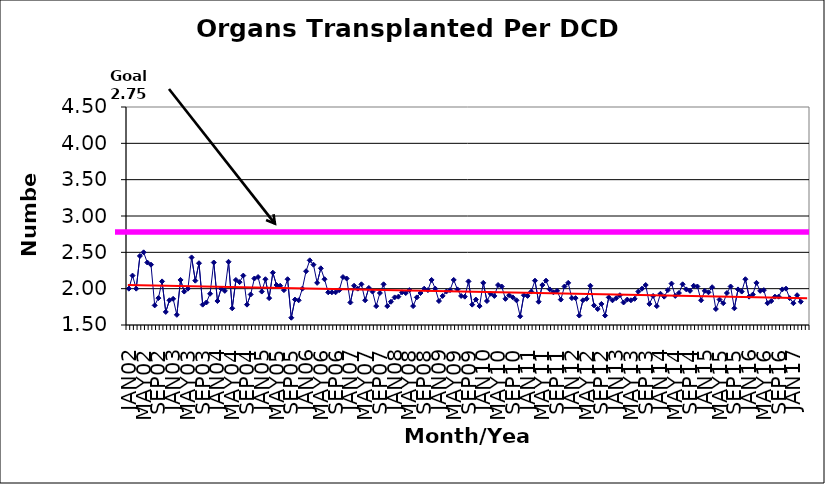
| Category | Series 0 |
|---|---|
| JAN02 | 2 |
| FEB02 | 2.18 |
| MAR02 | 2 |
| APR02 | 2.45 |
| MAY02 | 2.5 |
| JUN02 | 2.36 |
| JUL02 | 2.33 |
| AUG02 | 1.77 |
| SEP02 | 1.87 |
| OCT02 | 2.1 |
| NOV02 | 1.68 |
| DEC02 | 1.84 |
| JAN03 | 1.86 |
| FEB03 | 1.64 |
| MAR03 | 2.12 |
| APR03 | 1.96 |
| MAY03 | 2 |
| JUN03 | 2.43 |
| JUL03 | 2.11 |
| AUG03 | 2.35 |
| SEP03 | 1.78 |
| OCT03 | 1.81 |
| NOV03 | 1.93 |
| DEC03 | 2.36 |
| JAN04 | 1.83 |
| FEB04 | 2 |
| MAR04 | 1.97 |
| APR04 | 2.37 |
| MAY04 | 1.73 |
| JUN04 | 2.12 |
| JUL04 | 2.09 |
| AUG04 | 2.18 |
| SEP04 | 1.78 |
| OCT04 | 1.92 |
| NOV04 | 2.14 |
| DEC04 | 2.16 |
| JAN05 | 1.96 |
| FEB05 | 2.13 |
| MAR05 | 1.87 |
| APR05 | 2.22 |
| MAY05 | 2.05 |
| JUN05 | 2.04 |
| JUL05 | 1.98 |
| AUG05 | 2.13 |
| SEP05 | 1.6 |
| OCT05 | 1.85 |
| NOV05 | 1.84 |
| DEC05 | 2 |
| JAN06 | 2.24 |
| FEB06 | 2.39 |
| MAR06 | 2.33 |
| APR06 | 2.08 |
| MAY06 | 2.28 |
| JUN06 | 2.13 |
| JUL06 | 1.95 |
| AUG06 | 1.95 |
| SEP06 | 1.95 |
| OCT06 | 1.98 |
| NOV06 | 2.16 |
| DEC06 | 2.14 |
| JAN07 | 1.81 |
| FEB07 | 2.04 |
| MAR07 | 2 |
| APR07 | 2.06 |
| MAY07 | 1.84 |
| JUN07 | 2.01 |
| JUL07 | 1.96 |
| AUG07 | 1.76 |
| SEP07 | 1.94 |
| OCT07 | 2.06 |
| NOV07 | 1.76 |
| DEC07 | 1.82 |
| JAN08 | 1.88 |
| FEB08 | 1.89 |
| MAR08 | 1.95 |
| APR08 | 1.94 |
| MAY08 | 1.98 |
| JUN08 | 1.76 |
| JUL08 | 1.88 |
| AUG08 | 1.94 |
| SEP08 | 2 |
| OCT08 | 1.98 |
| NOV08 | 2.12 |
| DEC08 | 2 |
| JAN09 | 1.83 |
| FEB09 | 1.9 |
| MAR09 | 1.96 |
| APR09 | 1.98 |
| MAY09 | 2.12 |
| JUN09 | 1.99 |
| JUL09 | 1.9 |
| AUG09 | 1.89 |
| SEP09 | 2.1 |
| OCT09 | 1.78 |
| NOV09 | 1.85 |
| DEC09 | 1.76 |
| JAN10 | 2.08 |
| FEB10 | 1.83 |
| MAR10 | 1.93 |
| APR10 | 1.9 |
| MAY10 | 2.05 |
| JUN10 | 2.03 |
| JUL10 | 1.86 |
| AUG10 | 1.91 |
| SEP10 | 1.88 |
| OCT10 | 1.84 |
| NOV10 | 1.62 |
| DEC10 | 1.91 |
| JAN11 | 1.9 |
| FEB11 | 1.96 |
| MAR11 | 2.11 |
| APR11 | 1.82 |
| MAY11 | 2.05 |
| JUN11 | 2.11 |
| JUL11 | 1.99 |
| AUG11 | 1.95 |
| SEP11 | 1.97 |
| OCT11 | 1.85 |
| NOV11 | 2.03 |
| DEC11 | 2.08 |
| JAN12 | 1.87 |
| FEB12 | 1.87 |
| MAR12 | 1.63 |
| APR12 | 1.84 |
| MAY12 | 1.86 |
| JUN12 | 2.04 |
| JUL12 | 1.77 |
| AUG12 | 1.72 |
| SEP12 | 1.79 |
| OCT12 | 1.63 |
| NOV12 | 1.88 |
| DEC12 | 1.84 |
| JAN13 | 1.87 |
| FEB13 | 1.91 |
| MAR13 | 1.81 |
| APR13 | 1.85 |
| MAY13 | 1.84 |
| JUN13 | 1.86 |
| JUL13 | 1.96 |
| AUG13 | 2 |
| SEP13 | 2.05 |
| OCT13 | 1.79 |
| NOV13 | 1.9 |
| DEC13 | 1.76 |
| JAN14 | 1.93 |
| FEB14 | 1.89 |
| MAR14 | 1.98 |
| APR14 | 2.07 |
| MAY14 | 1.9 |
| JUN14 | 1.94 |
| JUL14 | 2.06 |
| AUG14 | 1.99 |
| SEP14 | 1.97 |
| OCT14 | 2.04 |
| NOV14 | 2.03 |
| DEC14 | 1.84 |
| JAN15 | 1.97 |
| FEB15 | 1.95 |
| MAR15 | 2.02 |
| APR15 | 1.72 |
| MAY15 | 1.85 |
| JUN15 | 1.8 |
| JUL15 | 1.94 |
| AUG15 | 2.03 |
| SEP15 | 1.73 |
| OCT15 | 1.99 |
| NOV15 | 1.96 |
| DEC15 | 2.13 |
| JAN16 | 1.89 |
| FEB16 | 1.92 |
| MAR16 | 2.08 |
| APR16 | 1.97 |
| MAY16 | 1.98 |
| JUN16 | 1.8 |
| JUL16 | 1.83 |
| AUG16 | 1.89 |
| SEP16 | 1.89 |
| OCT16 | 1.99 |
| NOV16 | 2 |
| DEC16 | 1.87 |
| JAN17 | 1.8 |
| FEB17 | 1.91 |
| MAR17 | 1.82 |